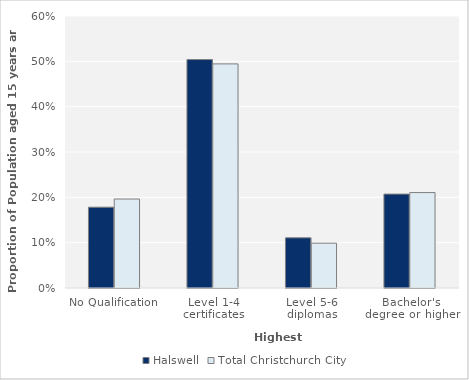
| Category | Halswell | Total Christchurch City |
|---|---|---|
| No Qualification | 0.178 | 0.196 |
| Level 1-4 certificates | 0.504 | 0.494 |
| Level 5-6 diplomas | 0.111 | 0.099 |
| Bachelor's degree or higher | 0.207 | 0.211 |